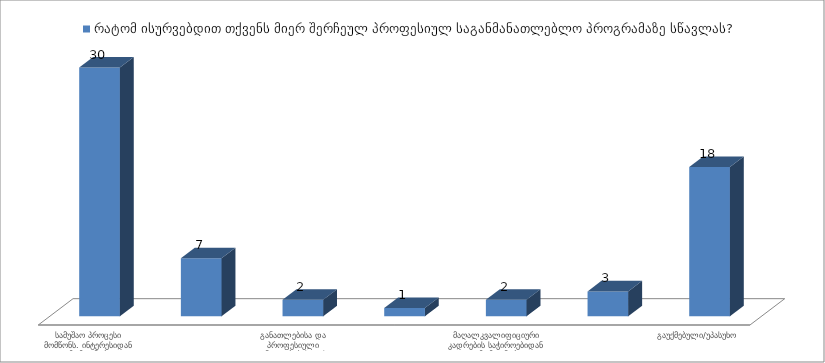
| Category | რატომ ისურვებდით თქვენს მიერ შერჩეულ პროფესიულ საგანმანათლებლო პროგრამაზე სწავლას? |
|---|---|
| სამუშაო პროცესი მომწონს. ინტერესიდან გამომდინარე.  | 30 |
| მოთხოვნადი, საჭირო და სტაბილური პროფესიაა | 7 |
| განათლებისა და პროფესიული განვითარებისთვის | 2 |
| კომპიუტერი ჩემი ცხოვრებაა | 1 |
| მაღალკვალიფიციური კადრების საჭიროებიდან გამომდინარე | 2 |
| მიყვარს ბავშვებთან ურთიერთობა | 3 |
| გაუქმებული/უპასუხო | 18 |